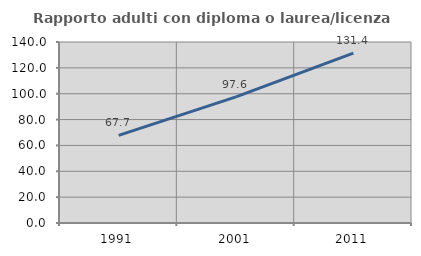
| Category | Rapporto adulti con diploma o laurea/licenza media  |
|---|---|
| 1991.0 | 67.728 |
| 2001.0 | 97.605 |
| 2011.0 | 131.432 |